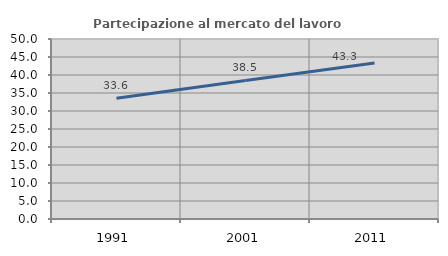
| Category | Partecipazione al mercato del lavoro  femminile |
|---|---|
| 1991.0 | 33.554 |
| 2001.0 | 38.479 |
| 2011.0 | 43.312 |